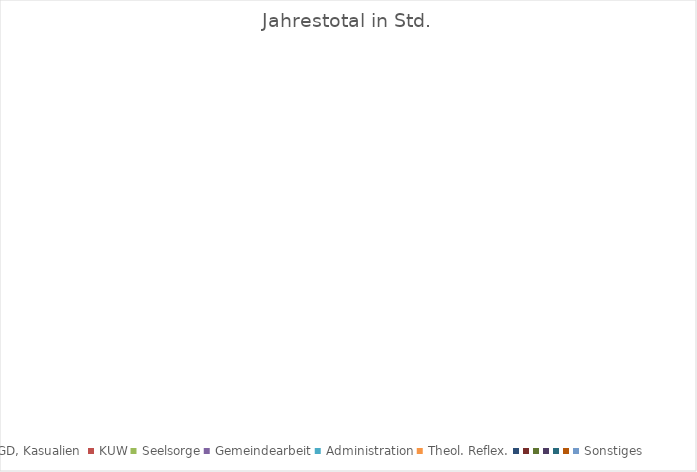
| Category | Jahrestotal in Std. |
|---|---|
| GD, Kasualien  | 0 |
| KUW | 0 |
| Seelsorge | 0 |
| Gemeindearbeit | 0 |
| Administration | 0 |
| Theol. Reflex. | 0 |
|  | 0 |
|  | 0 |
|  | 0 |
|  | 0 |
|  | 0 |
|  | 0 |
| Sonstiges | 0 |